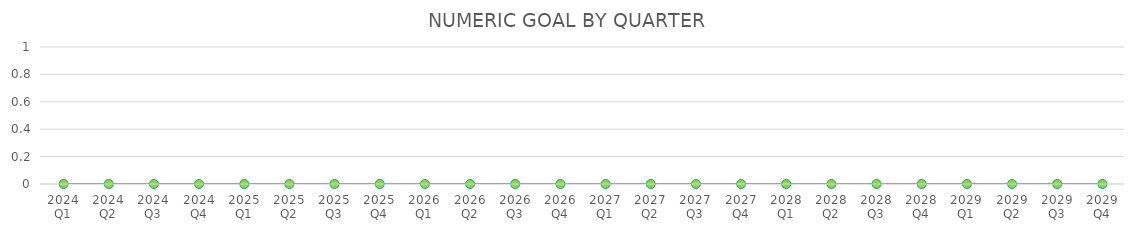
| Category | NUMERIC GOAL |
|---|---|
| 2024 Q1 | 0 |
| 2024 Q2 | 0 |
| 2024 Q3 | 0 |
| 2024 Q4 | 0 |
| 2025 Q1 | 0 |
| 2025 Q2 | 0 |
| 2025 Q3 | 0 |
| 2025 Q4 | 0 |
| 2026 Q1 | 0 |
| 2026 Q2 | 0 |
| 2026 Q3 | 0 |
| 2026 Q4 | 0 |
| 2027 Q1 | 0 |
| 2027 Q2 | 0 |
| 2027 Q3 | 0 |
| 2027 Q4 | 0 |
| 2028 Q1 | 0 |
| 2028 Q2 | 0 |
| 2028 Q3 | 0 |
| 2028 Q4 | 0 |
| 2029 Q1 | 0 |
| 2029 Q2 | 0 |
| 2029 Q3 | 0 |
| 2029 Q4 | 0 |